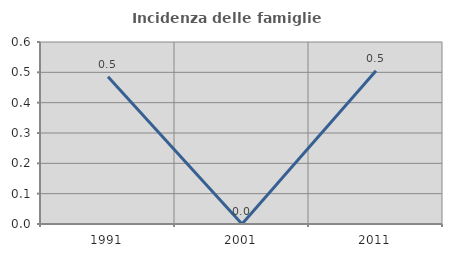
| Category | Incidenza delle famiglie numerose |
|---|---|
| 1991.0 | 0.485 |
| 2001.0 | 0 |
| 2011.0 | 0.505 |